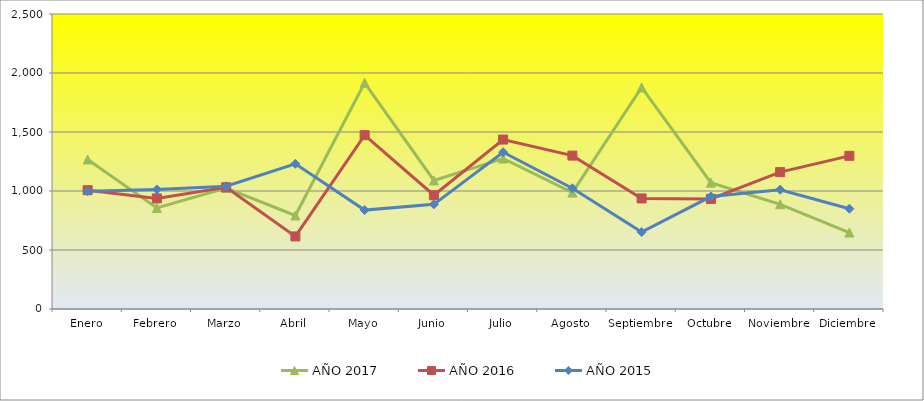
| Category | AÑO 2017 | AÑO 2016 | AÑO 2015 |
|---|---|---|---|
| Enero | 1266.984 | 1007 | 998 |
| Febrero | 856.349 | 937 | 1013 |
| Marzo | 1025.556 | 1032 | 1040 |
| Abril | 792.381 | 615 | 1230 |
| Mayo | 1916.984 | 1473 | 838 |
| Junio | 1089.524 | 964 | 887 |
| Julio | 1275.238 | 1436 | 1329 |
| Agosto | 986.349 | 1300 | 1023 |
| Septiembre | 1877.778 | 937 | 652 |
| Octubre | 1070.952 | 933 | 953 |
| Noviembre | 887.302 | 1160 | 1011 |
| Diciembre | 647.937 | 1298 | 850 |